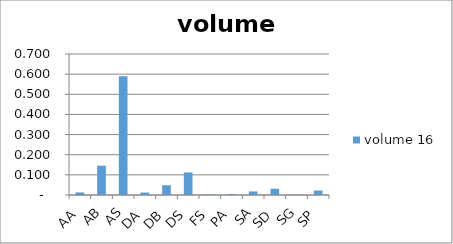
| Category |  volume 16  |
|---|---|
| AA | 0.013 |
| AB | 0.146 |
| AS | 0.589 |
| DA | 0.012 |
| DB | 0.048 |
| DS | 0.112 |
| FS | 0.002 |
| PA | 0.004 |
| SA | 0.018 |
| SD | 0.031 |
| SG | 0.002 |
| SP | 0.022 |